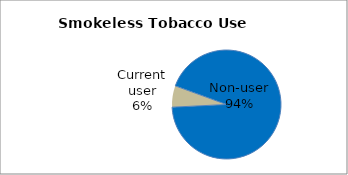
| Category | Series 0 |
|---|---|
| Non-user | 93.655 |
| Current user | 6.345 |